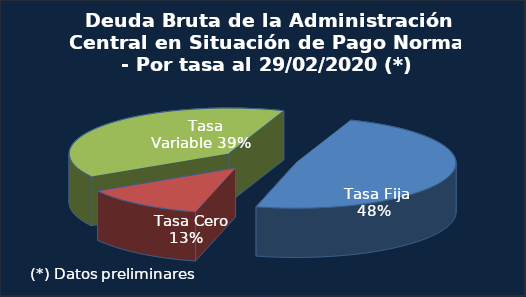
| Category | Series 0 |
|---|---|
|   Tasa Fija | 155983.5 |
|   Tasa Cero | 40268 |
|   Tasa Variable | 125595.8 |